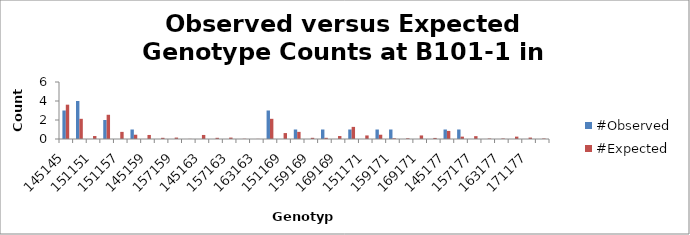
| Category | #Observed | #Expected |
|---|---|---|
| 145145.0 | 3 | 3.612 |
| 145151.0 | 4 | 2.125 |
| 151151.0 | 0 | 0.312 |
| 145157.0 | 2 | 2.55 |
| 151157.0 | 0 | 0.75 |
| 157157.0 | 1 | 0.45 |
| 145159.0 | 0 | 0.425 |
| 151159.0 | 0 | 0.125 |
| 157159.0 | 0 | 0.15 |
| 159159.0 | 0 | 0.012 |
| 145163.0 | 0 | 0.425 |
| 151163.0 | 0 | 0.125 |
| 157163.0 | 0 | 0.15 |
| 159163.0 | 0 | 0.025 |
| 163163.0 | 0 | 0.012 |
| 145169.0 | 3 | 2.125 |
| 151169.0 | 0 | 0.625 |
| 157169.0 | 1 | 0.75 |
| 159169.0 | 0 | 0.125 |
| 163169.0 | 1 | 0.125 |
| 169169.0 | 0 | 0.312 |
| 145171.0 | 1 | 1.275 |
| 151171.0 | 0 | 0.375 |
| 157171.0 | 1 | 0.45 |
| 159171.0 | 1 | 0.075 |
| 163171.0 | 0 | 0.075 |
| 169171.0 | 0 | 0.375 |
| 171171.0 | 0 | 0.112 |
| 145177.0 | 1 | 0.85 |
| 151177.0 | 1 | 0.25 |
| 157177.0 | 0 | 0.3 |
| 159177.0 | 0 | 0.05 |
| 163177.0 | 0 | 0.05 |
| 169177.0 | 0 | 0.25 |
| 171177.0 | 0 | 0.15 |
| 177177.0 | 0 | 0.05 |